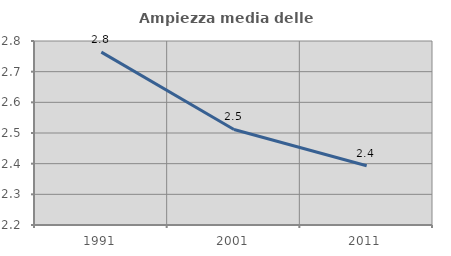
| Category | Ampiezza media delle famiglie |
|---|---|
| 1991.0 | 2.764 |
| 2001.0 | 2.512 |
| 2011.0 | 2.393 |